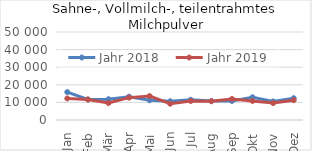
| Category | Jahr 2018 | Jahr 2019 |
|---|---|---|
| Jan | 15865.472 | 12242.279 |
| Feb | 11714.592 | 11625.254 |
| Mär | 11808.635 | 9645.491 |
| Apr | 13232.941 | 12709.082 |
| Mai | 11219.239 | 13596.717 |
| Jun | 10658.097 | 9228.763 |
| Jul | 11476.858 | 10794.812 |
| Aug | 10749.015 | 10667.536 |
| Sep | 10834.273 | 11912.859 |
| Okt | 12913.313 | 10824.272 |
| Nov | 10544.874 | 9641.022 |
| Dez | 12392.557 | 11246.861 |